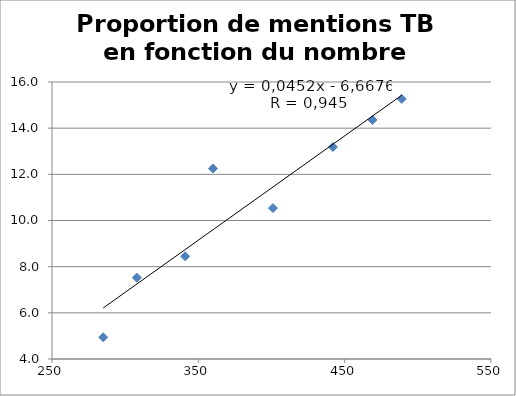
| Category | Proportion de mentions TB en fonction du nombre d'Adèle |
|---|---|
| 285.0 | 4.941 |
| 308.0 | 7.521 |
| 341.0 | 8.451 |
| 401.0 | 10.539 |
| 360.0 | 12.251 |
| 442.0 | 13.185 |
| 469.0 | 14.356 |
| 489.0 | 15.266 |